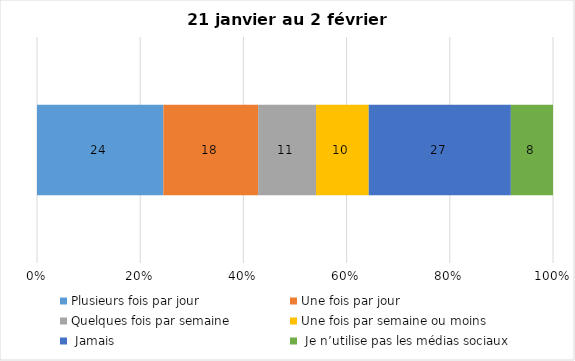
| Category | Plusieurs fois par jour | Une fois par jour | Quelques fois par semaine   | Une fois par semaine ou moins   |  Jamais   |  Je n’utilise pas les médias sociaux |
|---|---|---|---|---|---|---|
| 0 | 24 | 18 | 11 | 10 | 27 | 8 |